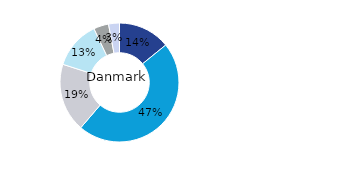
| Category | Danmark |
|---|---|
| Kontor | 0.142 |
| Bostäder | 0.471 |
| Handel | 0.187 |
| Logistik* | 0.13 |
| Samhällsfastigheter | 0.041 |
| Övrigt | 0.03 |